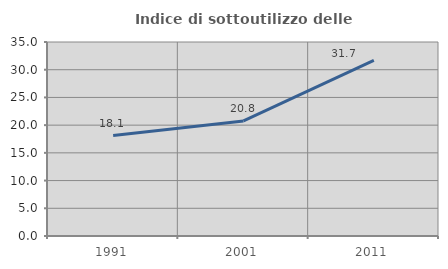
| Category | Indice di sottoutilizzo delle abitazioni  |
|---|---|
| 1991.0 | 18.129 |
| 2001.0 | 20.765 |
| 2011.0 | 31.699 |